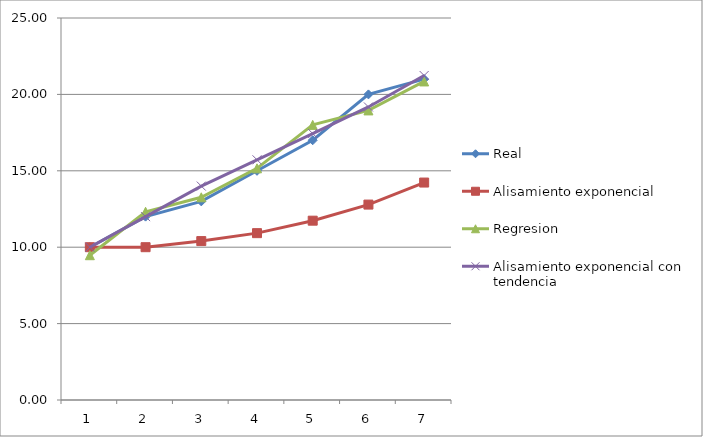
| Category | Real | Alisamiento exponencial | Regresion | Alisamiento exponencial con tendencia |
|---|---|---|---|---|
| 0 | 10 | 10 | 9.476 | 10 |
| 1 | 12 | 10 | 12.319 | 12 |
| 2 | 13 | 10.4 | 13.267 | 14 |
| 3 | 15 | 10.92 | 15.162 | 15.72 |
| 4 | 17 | 11.736 | 18.005 | 17.438 |
| 5 | 20 | 12.789 | 18.952 | 19.178 |
| 6 | 21 | 14.231 | 20.847 | 21.236 |